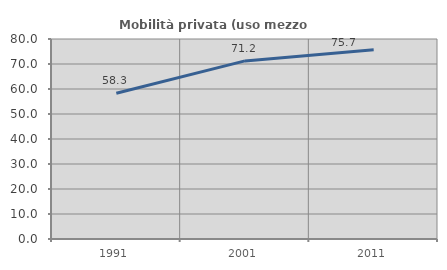
| Category | Mobilità privata (uso mezzo privato) |
|---|---|
| 1991.0 | 58.319 |
| 2001.0 | 71.235 |
| 2011.0 | 75.741 |